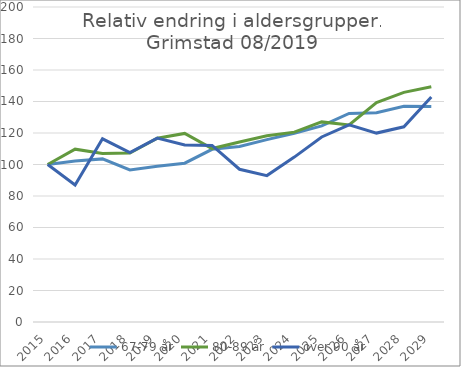
| Category | 67-79 år | 80-89 år | over 90 år |
|---|---|---|---|
| 2015.0 | 100 | 100 | 100 |
| 2016.0 | 102.292 | 109.737 | 86.957 |
| 2017.0 | 103.565 | 106.955 | 116.304 |
| 2018.0 | 96.562 | 107.264 | 107.609 |
| 2019.0 | 98.882 | 116.729 | 116.75 |
| 2020.0 | 100.846 | 119.743 | 112.41 |
| 2021.0 | 109.638 | 110.125 | 112.101 |
| 2022.0 | 111.386 | 114.316 | 96.983 |
| 2023.0 | 115.791 | 118.221 | 92.96 |
| 2024.0 | 119.818 | 120.553 | 104.701 |
| 2025.0 | 124.552 | 127.045 | 117.491 |
| 2026.0 | 132.434 | 125.085 | 125.197 |
| 2027.0 | 132.854 | 139.382 | 119.946 |
| 2028.0 | 136.971 | 145.788 | 123.933 |
| 2029.0 | 136.823 | 149.343 | 142.846 |